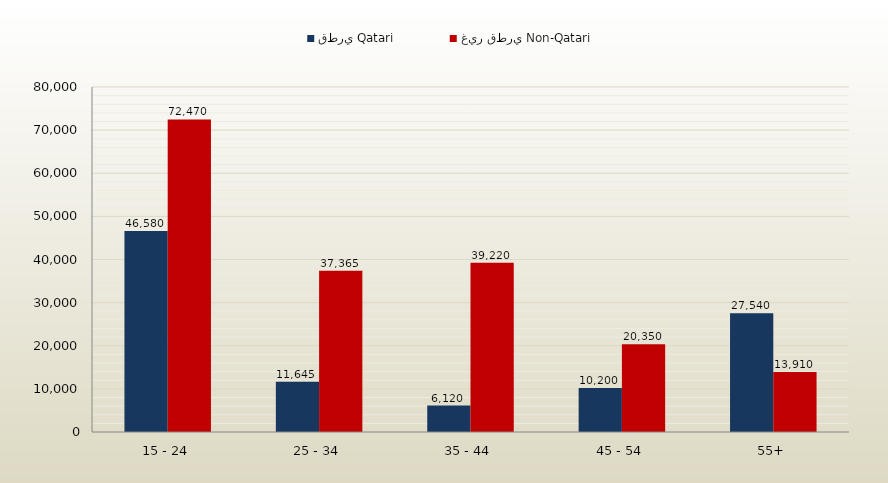
| Category | قطري Qatari | غير قطري Non-Qatari |
|---|---|---|
| 15 - 24 | 46580 | 72470 |
| 25 - 34 | 11645 | 37365 |
| 35 - 44 | 6120 | 39220 |
| 45 - 54 | 10200 | 20350 |
| 55+ | 27540 | 13910 |